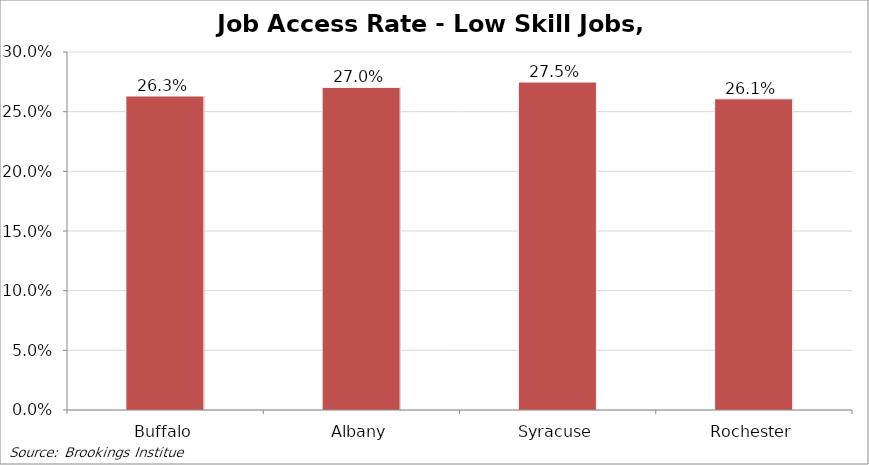
| Category | Job Access Rate - Low Skill Jobs All |
|---|---|
| Buffalo | 0.263 |
| Albany | 0.27 |
| Syracuse | 0.275 |
| Rochester | 0.261 |